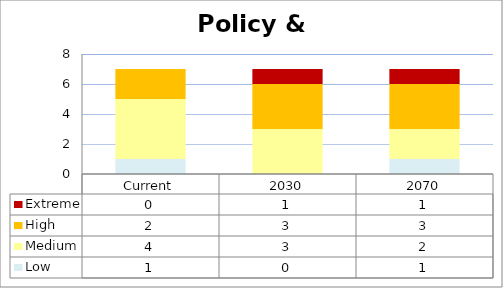
| Category | Low | Medium | High | Extreme |
|---|---|---|---|---|
| Current | 1 | 4 | 2 | 0 |
| 2030 | 0 | 3 | 3 | 1 |
| 2070 | 1 | 2 | 3 | 1 |